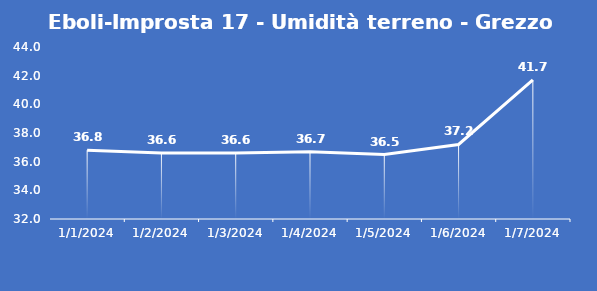
| Category | Eboli-Improsta 17 - Umidità terreno - Grezzo (%VWC) |
|---|---|
| 1/1/24 | 36.8 |
| 1/2/24 | 36.6 |
| 1/3/24 | 36.6 |
| 1/4/24 | 36.7 |
| 1/5/24 | 36.5 |
| 1/6/24 | 37.2 |
| 1/7/24 | 41.7 |